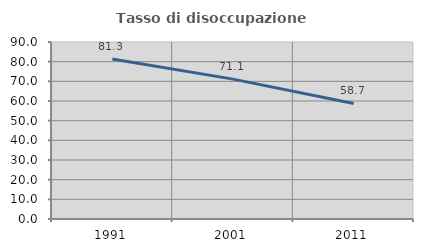
| Category | Tasso di disoccupazione giovanile  |
|---|---|
| 1991.0 | 81.326 |
| 2001.0 | 71.128 |
| 2011.0 | 58.739 |